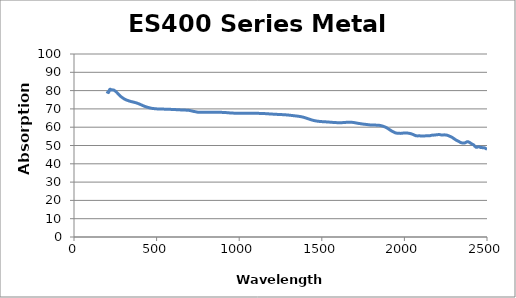
| Category | Absorption (%) |
|---|---|
| 200.0 | 78.419 |
| 205.0 | 79.251 |
| 210.0 | 79.05 |
| 215.0 | 80.511 |
| 220.0 | 80.748 |
| 225.0 | 80.293 |
| 230.0 | 80.406 |
| 235.0 | 80.361 |
| 240.0 | 80.307 |
| 245.0 | 80.048 |
| 250.0 | 79.743 |
| 255.0 | 79.36 |
| 260.0 | 78.921 |
| 265.0 | 78.459 |
| 270.0 | 77.98 |
| 275.0 | 77.518 |
| 280.0 | 77.083 |
| 285.0 | 76.658 |
| 290.0 | 76.328 |
| 295.0 | 75.977 |
| 300.0 | 75.691 |
| 305.0 | 75.414 |
| 310.0 | 75.18 |
| 315.0 | 74.957 |
| 320.0 | 74.755 |
| 325.0 | 74.608 |
| 330.0 | 74.457 |
| 335.0 | 74.293 |
| 340.0 | 74.16 |
| 345.0 | 74.028 |
| 350.0 | 73.92 |
| 355.0 | 73.817 |
| 360.0 | 73.71 |
| 365.0 | 73.591 |
| 370.0 | 73.471 |
| 375.0 | 73.351 |
| 380.0 | 73.187 |
| 385.0 | 73.031 |
| 390.0 | 72.862 |
| 395.0 | 72.683 |
| 400.0 | 72.479 |
| 405.0 | 72.284 |
| 410.0 | 72.084 |
| 415.0 | 71.879 |
| 420.0 | 71.686 |
| 425.0 | 71.497 |
| 430.0 | 71.333 |
| 435.0 | 71.183 |
| 440.0 | 71.026 |
| 445.0 | 70.887 |
| 450.0 | 70.761 |
| 455.0 | 70.642 |
| 460.0 | 70.524 |
| 465.0 | 70.43 |
| 470.0 | 70.349 |
| 475.0 | 70.263 |
| 480.0 | 70.216 |
| 485.0 | 70.149 |
| 490.0 | 70.087 |
| 495.0 | 70.048 |
| 500.0 | 70.014 |
| 505.0 | 69.99 |
| 510.0 | 69.977 |
| 515.0 | 69.962 |
| 520.0 | 69.931 |
| 525.0 | 69.925 |
| 530.0 | 69.92 |
| 535.0 | 69.903 |
| 540.0 | 69.889 |
| 545.0 | 69.874 |
| 550.0 | 69.86 |
| 555.0 | 69.844 |
| 560.0 | 69.819 |
| 565.0 | 69.801 |
| 570.0 | 69.801 |
| 575.0 | 69.793 |
| 580.0 | 69.772 |
| 585.0 | 69.744 |
| 590.0 | 69.722 |
| 595.0 | 69.707 |
| 600.0 | 69.664 |
| 605.0 | 69.637 |
| 610.0 | 69.618 |
| 615.0 | 69.617 |
| 620.0 | 69.576 |
| 625.0 | 69.546 |
| 630.0 | 69.533 |
| 635.0 | 69.494 |
| 640.0 | 69.48 |
| 645.0 | 69.457 |
| 650.0 | 69.419 |
| 655.0 | 69.418 |
| 660.0 | 69.386 |
| 665.0 | 69.384 |
| 670.0 | 69.36 |
| 675.0 | 69.334 |
| 680.0 | 69.311 |
| 685.0 | 69.268 |
| 690.0 | 69.269 |
| 695.0 | 69.224 |
| 700.0 | 69.139 |
| 705.0 | 69.041 |
| 710.0 | 68.936 |
| 715.0 | 68.843 |
| 720.0 | 68.722 |
| 725.0 | 68.618 |
| 730.0 | 68.544 |
| 735.0 | 68.449 |
| 740.0 | 68.366 |
| 745.0 | 68.262 |
| 750.0 | 68.194 |
| 755.0 | 68.17 |
| 760.0 | 68.172 |
| 765.0 | 68.169 |
| 770.0 | 68.17 |
| 775.0 | 68.165 |
| 780.0 | 68.162 |
| 785.0 | 68.157 |
| 790.0 | 68.153 |
| 795.0 | 68.151 |
| 800.0 | 68.15 |
| 805.0 | 68.153 |
| 810.0 | 68.163 |
| 815.0 | 68.169 |
| 820.0 | 68.175 |
| 825.0 | 68.172 |
| 830.0 | 68.172 |
| 835.0 | 68.17 |
| 840.0 | 68.168 |
| 845.0 | 68.168 |
| 850.0 | 68.163 |
| 855.0 | 68.156 |
| 860.0 | 68.149 |
| 865.0 | 68.139 |
| 870.0 | 68.13 |
| 875.0 | 68.131 |
| 880.0 | 68.134 |
| 885.0 | 68.14 |
| 890.0 | 68.126 |
| 895.0 | 68.106 |
| 900.0 | 68.08 |
| 905.0 | 68.06 |
| 910.0 | 68.044 |
| 915.0 | 68.019 |
| 920.0 | 67.987 |
| 925.0 | 67.95 |
| 930.0 | 67.908 |
| 935.0 | 67.869 |
| 940.0 | 67.829 |
| 945.0 | 67.8 |
| 950.0 | 67.772 |
| 955.0 | 67.746 |
| 960.0 | 67.718 |
| 965.0 | 67.692 |
| 970.0 | 67.676 |
| 975.0 | 67.666 |
| 980.0 | 67.66 |
| 985.0 | 67.652 |
| 990.0 | 67.643 |
| 995.0 | 67.633 |
| 1000.0 | 67.628 |
| 1005.0 | 67.629 |
| 1010.0 | 67.637 |
| 1015.0 | 67.644 |
| 1020.0 | 67.646 |
| 1025.0 | 67.639 |
| 1030.0 | 67.632 |
| 1035.0 | 67.629 |
| 1040.0 | 67.63 |
| 1045.0 | 67.631 |
| 1050.0 | 67.63 |
| 1055.0 | 67.624 |
| 1060.0 | 67.619 |
| 1065.0 | 67.616 |
| 1070.0 | 67.617 |
| 1075.0 | 67.617 |
| 1080.0 | 67.616 |
| 1085.0 | 67.613 |
| 1090.0 | 67.604 |
| 1095.0 | 67.59 |
| 1100.0 | 67.579 |
| 1105.0 | 67.573 |
| 1110.0 | 67.572 |
| 1115.0 | 67.566 |
| 1120.0 | 67.553 |
| 1125.0 | 67.535 |
| 1130.0 | 67.518 |
| 1135.0 | 67.5 |
| 1140.0 | 67.482 |
| 1145.0 | 67.467 |
| 1150.0 | 67.452 |
| 1155.0 | 67.431 |
| 1160.0 | 67.404 |
| 1165.0 | 67.371 |
| 1170.0 | 67.34 |
| 1175.0 | 67.309 |
| 1180.0 | 67.278 |
| 1185.0 | 67.249 |
| 1190.0 | 67.222 |
| 1195.0 | 67.193 |
| 1200.0 | 67.161 |
| 1205.0 | 67.128 |
| 1210.0 | 67.101 |
| 1215.0 | 67.075 |
| 1220.0 | 67.051 |
| 1225.0 | 67.026 |
| 1230.0 | 67.004 |
| 1235.0 | 66.982 |
| 1240.0 | 66.957 |
| 1245.0 | 66.931 |
| 1250.0 | 66.91 |
| 1255.0 | 66.892 |
| 1260.0 | 66.871 |
| 1265.0 | 66.845 |
| 1270.0 | 66.818 |
| 1275.0 | 66.791 |
| 1280.0 | 66.76 |
| 1285.0 | 66.726 |
| 1290.0 | 66.686 |
| 1295.0 | 66.647 |
| 1300.0 | 66.606 |
| 1305.0 | 66.558 |
| 1310.0 | 66.502 |
| 1315.0 | 66.446 |
| 1320.0 | 66.393 |
| 1325.0 | 66.341 |
| 1330.0 | 66.287 |
| 1335.0 | 66.233 |
| 1340.0 | 66.18 |
| 1345.0 | 66.129 |
| 1350.0 | 66.073 |
| 1355.0 | 66.014 |
| 1360.0 | 65.951 |
| 1365.0 | 65.886 |
| 1370.0 | 65.814 |
| 1375.0 | 65.73 |
| 1380.0 | 65.636 |
| 1385.0 | 65.531 |
| 1390.0 | 65.413 |
| 1395.0 | 65.284 |
| 1400.0 | 65.145 |
| 1405.0 | 64.999 |
| 1410.0 | 64.848 |
| 1415.0 | 64.691 |
| 1420.0 | 64.534 |
| 1425.0 | 64.379 |
| 1430.0 | 64.228 |
| 1435.0 | 64.082 |
| 1440.0 | 63.941 |
| 1445.0 | 63.813 |
| 1450.0 | 63.695 |
| 1455.0 | 63.59 |
| 1460.0 | 63.497 |
| 1465.0 | 63.412 |
| 1470.0 | 63.339 |
| 1475.0 | 63.273 |
| 1480.0 | 63.217 |
| 1485.0 | 63.167 |
| 1490.0 | 63.123 |
| 1495.0 | 63.087 |
| 1500.0 | 63.053 |
| 1505.0 | 63.022 |
| 1510.0 | 62.993 |
| 1515.0 | 62.966 |
| 1520.0 | 62.942 |
| 1525.0 | 62.915 |
| 1530.0 | 62.887 |
| 1535.0 | 62.854 |
| 1540.0 | 62.82 |
| 1545.0 | 62.786 |
| 1550.0 | 62.75 |
| 1555.0 | 62.712 |
| 1560.0 | 62.672 |
| 1565.0 | 62.634 |
| 1570.0 | 62.596 |
| 1575.0 | 62.564 |
| 1580.0 | 62.537 |
| 1585.0 | 62.513 |
| 1590.0 | 62.493 |
| 1595.0 | 62.476 |
| 1600.0 | 62.465 |
| 1605.0 | 62.461 |
| 1610.0 | 62.462 |
| 1615.0 | 62.468 |
| 1620.0 | 62.475 |
| 1625.0 | 62.498 |
| 1630.0 | 62.53 |
| 1635.0 | 62.568 |
| 1640.0 | 62.6 |
| 1645.0 | 62.631 |
| 1650.0 | 62.674 |
| 1655.0 | 62.709 |
| 1660.0 | 62.729 |
| 1665.0 | 62.732 |
| 1670.0 | 62.731 |
| 1675.0 | 62.723 |
| 1680.0 | 62.692 |
| 1685.0 | 62.644 |
| 1690.0 | 62.59 |
| 1695.0 | 62.524 |
| 1700.0 | 62.45 |
| 1705.0 | 62.361 |
| 1710.0 | 62.275 |
| 1715.0 | 62.195 |
| 1720.0 | 62.115 |
| 1725.0 | 62.046 |
| 1730.0 | 61.982 |
| 1735.0 | 61.919 |
| 1740.0 | 61.838 |
| 1745.0 | 61.754 |
| 1750.0 | 61.697 |
| 1755.0 | 61.654 |
| 1760.0 | 61.606 |
| 1765.0 | 61.545 |
| 1770.0 | 61.477 |
| 1775.0 | 61.431 |
| 1780.0 | 61.372 |
| 1785.0 | 61.314 |
| 1790.0 | 61.26 |
| 1795.0 | 61.232 |
| 1800.0 | 61.227 |
| 1805.0 | 61.22 |
| 1810.0 | 61.202 |
| 1815.0 | 61.183 |
| 1820.0 | 61.163 |
| 1825.0 | 61.146 |
| 1830.0 | 61.122 |
| 1835.0 | 61.102 |
| 1840.0 | 61.078 |
| 1845.0 | 61.053 |
| 1850.0 | 60.996 |
| 1855.0 | 60.919 |
| 1860.0 | 60.813 |
| 1865.0 | 60.698 |
| 1870.0 | 60.559 |
| 1875.0 | 60.386 |
| 1880.0 | 60.208 |
| 1885.0 | 60.027 |
| 1890.0 | 59.829 |
| 1895.0 | 59.571 |
| 1900.0 | 59.27 |
| 1905.0 | 58.976 |
| 1910.0 | 58.689 |
| 1915.0 | 58.384 |
| 1920.0 | 58.084 |
| 1925.0 | 57.799 |
| 1930.0 | 57.568 |
| 1935.0 | 57.341 |
| 1940.0 | 57.114 |
| 1945.0 | 56.919 |
| 1950.0 | 56.801 |
| 1955.0 | 56.736 |
| 1960.0 | 56.707 |
| 1965.0 | 56.649 |
| 1970.0 | 56.643 |
| 1975.0 | 56.619 |
| 1980.0 | 56.647 |
| 1985.0 | 56.682 |
| 1990.0 | 56.752 |
| 1995.0 | 56.804 |
| 2000.0 | 56.829 |
| 2005.0 | 56.847 |
| 2010.0 | 56.855 |
| 2015.0 | 56.827 |
| 2020.0 | 56.775 |
| 2025.0 | 56.694 |
| 2030.0 | 56.633 |
| 2035.0 | 56.54 |
| 2040.0 | 56.419 |
| 2045.0 | 56.263 |
| 2050.0 | 56.099 |
| 2055.0 | 55.939 |
| 2060.0 | 55.706 |
| 2065.0 | 55.5 |
| 2070.0 | 55.328 |
| 2075.0 | 55.284 |
| 2080.0 | 55.247 |
| 2085.0 | 55.263 |
| 2090.0 | 55.281 |
| 2095.0 | 55.264 |
| 2100.0 | 55.209 |
| 2105.0 | 55.135 |
| 2110.0 | 55.147 |
| 2115.0 | 55.186 |
| 2120.0 | 55.241 |
| 2125.0 | 55.255 |
| 2130.0 | 55.272 |
| 2135.0 | 55.303 |
| 2140.0 | 55.289 |
| 2145.0 | 55.277 |
| 2150.0 | 55.269 |
| 2155.0 | 55.355 |
| 2160.0 | 55.482 |
| 2165.0 | 55.603 |
| 2170.0 | 55.67 |
| 2175.0 | 55.662 |
| 2180.0 | 55.684 |
| 2185.0 | 55.725 |
| 2190.0 | 55.796 |
| 2195.0 | 55.842 |
| 2200.0 | 55.902 |
| 2205.0 | 55.957 |
| 2210.0 | 55.983 |
| 2215.0 | 55.928 |
| 2220.0 | 55.818 |
| 2225.0 | 55.725 |
| 2230.0 | 55.731 |
| 2235.0 | 55.793 |
| 2240.0 | 55.808 |
| 2245.0 | 55.797 |
| 2250.0 | 55.731 |
| 2255.0 | 55.687 |
| 2260.0 | 55.584 |
| 2265.0 | 55.418 |
| 2270.0 | 55.227 |
| 2275.0 | 55.009 |
| 2280.0 | 54.846 |
| 2285.0 | 54.619 |
| 2290.0 | 54.361 |
| 2295.0 | 54.049 |
| 2300.0 | 53.753 |
| 2305.0 | 53.44 |
| 2310.0 | 53.133 |
| 2315.0 | 52.845 |
| 2320.0 | 52.621 |
| 2325.0 | 52.414 |
| 2330.0 | 52.175 |
| 2335.0 | 51.903 |
| 2340.0 | 51.643 |
| 2345.0 | 51.49 |
| 2350.0 | 51.413 |
| 2355.0 | 51.351 |
| 2360.0 | 51.34 |
| 2365.0 | 51.39 |
| 2370.0 | 51.626 |
| 2375.0 | 51.825 |
| 2380.0 | 52.084 |
| 2385.0 | 52.083 |
| 2390.0 | 51.883 |
| 2395.0 | 51.635 |
| 2400.0 | 51.323 |
| 2405.0 | 51.065 |
| 2410.0 | 50.755 |
| 2415.0 | 50.517 |
| 2420.0 | 50.291 |
| 2425.0 | 49.727 |
| 2430.0 | 49.303 |
| 2435.0 | 49.021 |
| 2440.0 | 49.035 |
| 2445.0 | 49.226 |
| 2450.0 | 49.292 |
| 2455.0 | 49.23 |
| 2460.0 | 48.943 |
| 2465.0 | 48.88 |
| 2470.0 | 48.879 |
| 2475.0 | 48.707 |
| 2480.0 | 48.774 |
| 2485.0 | 48.707 |
| 2490.0 | 48.481 |
| 2495.0 | 48.204 |
| 2500.0 | 47.967 |